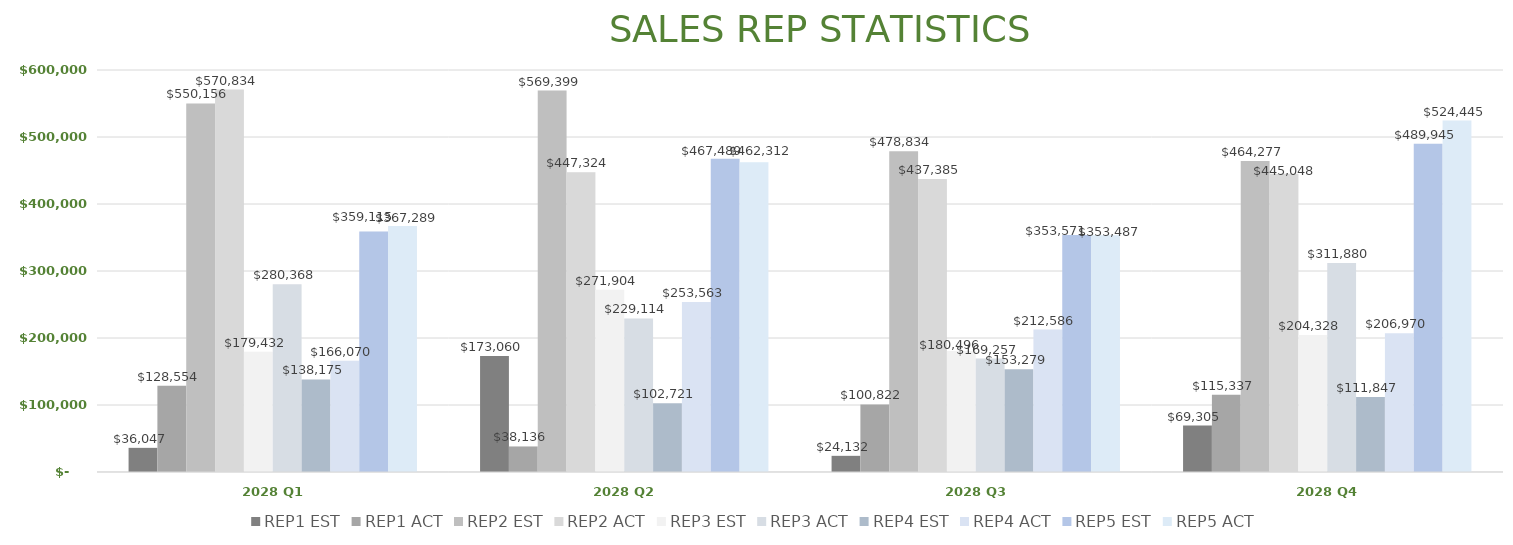
| Category | REP1 | REP2 | REP3 | REP4 | REP5 |
|---|---|---|---|---|---|
| 2028 Q1 | 128554 | 570834 | 280368 | 166070 | 367289 |
| 2028 Q2 | 38136 | 447324 | 229114 | 253563 | 462312 |
| 2028 Q3 | 100822 | 437385 | 169257 | 212586 | 353487 |
| 2028 Q4 | 115337 | 445048 | 311880 | 206970 | 524445 |